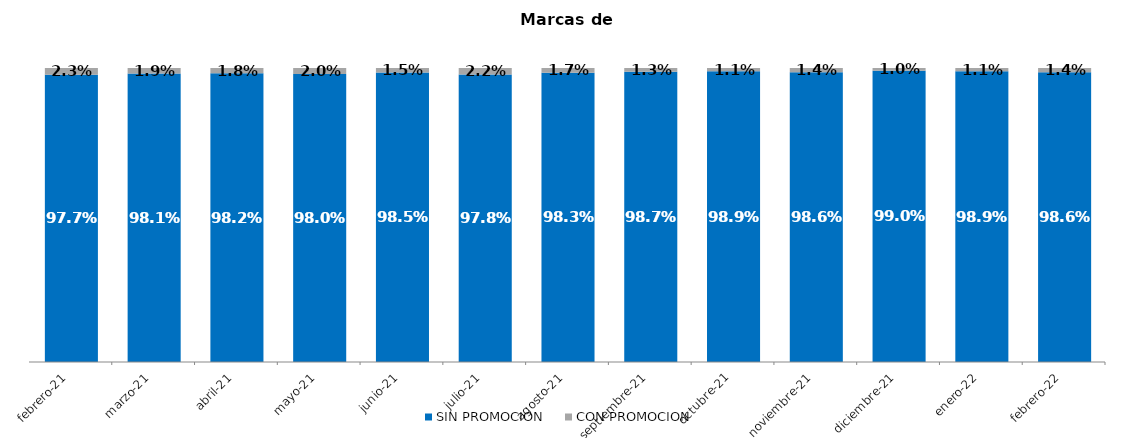
| Category | SIN PROMOCION   | CON PROMOCION   |
|---|---|---|
| 2021-02-01 | 0.977 | 0.023 |
| 2021-03-01 | 0.981 | 0.019 |
| 2021-04-01 | 0.982 | 0.018 |
| 2021-05-01 | 0.98 | 0.02 |
| 2021-06-01 | 0.985 | 0.015 |
| 2021-07-01 | 0.978 | 0.022 |
| 2021-08-01 | 0.983 | 0.017 |
| 2021-09-01 | 0.987 | 0.013 |
| 2021-10-01 | 0.989 | 0.011 |
| 2021-11-01 | 0.986 | 0.014 |
| 2021-12-01 | 0.99 | 0.01 |
| 2022-01-01 | 0.989 | 0.011 |
| 2022-02-01 | 0.986 | 0.014 |